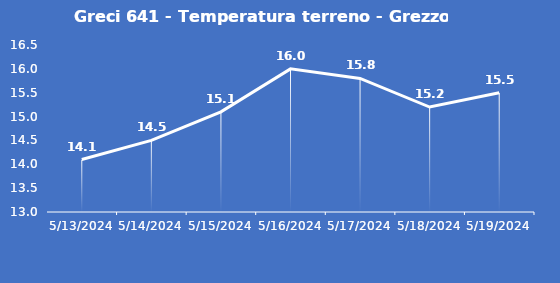
| Category | Greci 641 - Temperatura terreno - Grezzo (°C) |
|---|---|
| 5/13/24 | 14.1 |
| 5/14/24 | 14.5 |
| 5/15/24 | 15.1 |
| 5/16/24 | 16 |
| 5/17/24 | 15.8 |
| 5/18/24 | 15.2 |
| 5/19/24 | 15.5 |